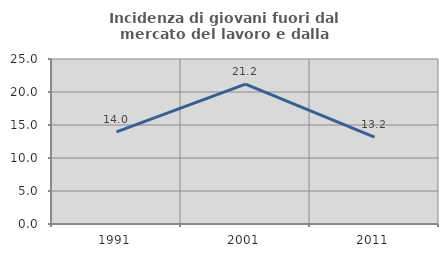
| Category | Incidenza di giovani fuori dal mercato del lavoro e dalla formazione  |
|---|---|
| 1991.0 | 13.96 |
| 2001.0 | 21.192 |
| 2011.0 | 13.171 |